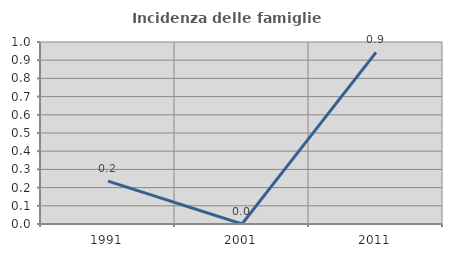
| Category | Incidenza delle famiglie numerose |
|---|---|
| 1991.0 | 0.236 |
| 2001.0 | 0 |
| 2011.0 | 0.943 |